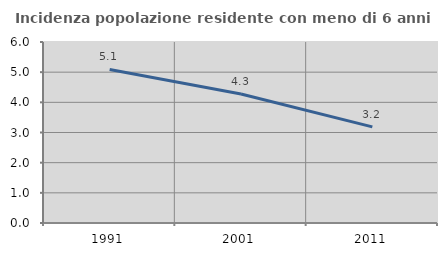
| Category | Incidenza popolazione residente con meno di 6 anni |
|---|---|
| 1991.0 | 5.089 |
| 2001.0 | 4.277 |
| 2011.0 | 3.186 |